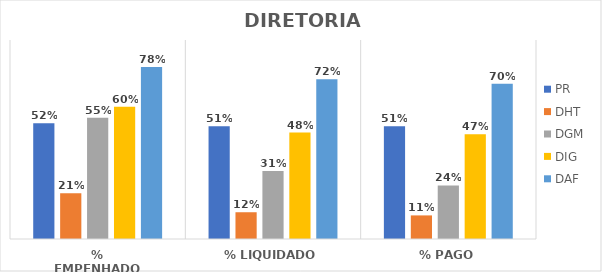
| Category | PR | DHT | DGM | DIG | DAF |
|---|---|---|---|---|---|
| % EMPENHADO | 0.523 | 0.206 | 0.548 | 0.598 | 0.778 |
| % LIQUIDADO | 0.51 | 0.121 | 0.307 | 0.481 | 0.723 |
| % PAGO | 0.51 | 0.107 | 0.242 | 0.474 | 0.702 |